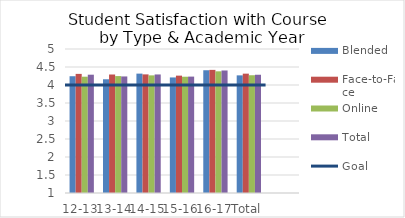
| Category | Blended | Face-to-Face | Online | Total |
|---|---|---|---|---|
| 12-13 | 4.244 | 4.309 | 4.231 | 4.286 |
| 13-14 | 4.159 | 4.292 | 4.248 | 4.238 |
| 14-15 | 4.316 | 4.295 | 4.268 | 4.293 |
| 15-16 | 4.21 | 4.26 | 4.23 | 4.233 |
| 16-17 | 4.41 | 4.42 | 4.38 | 4.403 |
| Total | 4.268 | 4.315 | 4.271 | 4.285 |